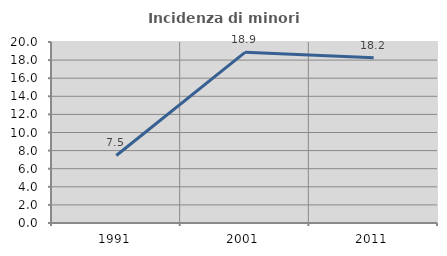
| Category | Incidenza di minori stranieri |
|---|---|
| 1991.0 | 7.463 |
| 2001.0 | 18.862 |
| 2011.0 | 18.246 |